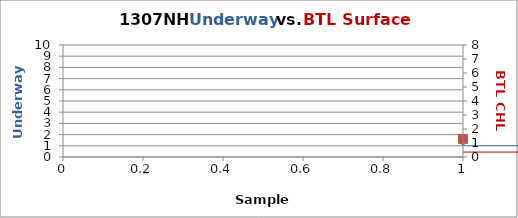
| Category |  FL |
|---|---|
| 0 | 1.423 |
| 1 | 0.316 |
| 2 | 0.338 |
| 3 | 0.246 |
| 4 | 0.261 |
| 5 | 0.268 |
| 6 | 0.192 |
| 7 | 0.755 |
| 8 | 2.059 |
| 9 | 1.668 |
| 10 | 0.263 |
| 11 | 0.708 |
| 12 | 0.346 |
| 13 | 0.193 |
| 14 | 0.09 |
| 15 | 0.106 |
| 16 | 0.099 |
| 17 | 0.364 |
| 18 | 1.073 |
| 19 | 2.994 |
| 20 | 1.812 |
| 21 | 1.807 |
| 22 | 9.401 |
| 23 | 2.192 |
| 24 | 1.369 |
| 25 | 0.484 |
| 26 | 1.116 |
| 27 | 0.206 |
| 28 | 0.107 |
| 29 | 0.169 |
| 30 | 1.85 |
| 31 | 0.904 |
| 32 | 1.217 |
| 33 | 1.997 |
| 34 | 1.709 |
| 35 | 1.177 |
| 36 | 0.684 |
| 37 | 1.327 |
| 38 | 0.908 |
| 39 | 5.075 |
| 40 | 4.725 |
| 41 | 4.452 |
| 42 | 1.352 |
| 43 | 3.04 |
| 44 | 1.635 |
| 45 | 0.303 |
| 46 | 0.257 |
| 47 | 0.462 |
| 48 | 0.685 |
| 49 | 0.928 |
| 50 | 7.716 |
| 51 | 1.866 |
| 52 | 5.043 |
| 53 | 3.531 |
| 54 | 2.112 |
| 55 | 6.498 |
| 56 | 1.346 |
| 57 | 0.683 |
| 58 | 0.491 |
| 59 | 1.196 |
| 60 | 0.734 |
| 61 | 1.099 |
| 62 | 1.243 |
| 63 | 1.223 |
| 64 | 0.811 |
| 65 | 0.366 |
| 66 | 0.345 |
| 67 | 0.348 |
| 68 | 0.601 |